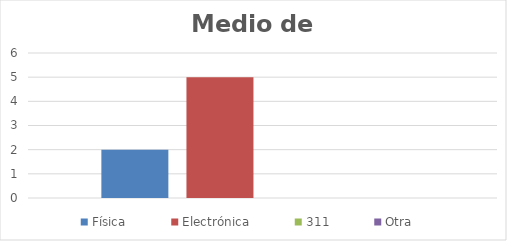
| Category | Física | Electrónica | 311 | Otra |
|---|---|---|---|---|
| 0 | 2 | 5 | 0 | 0 |